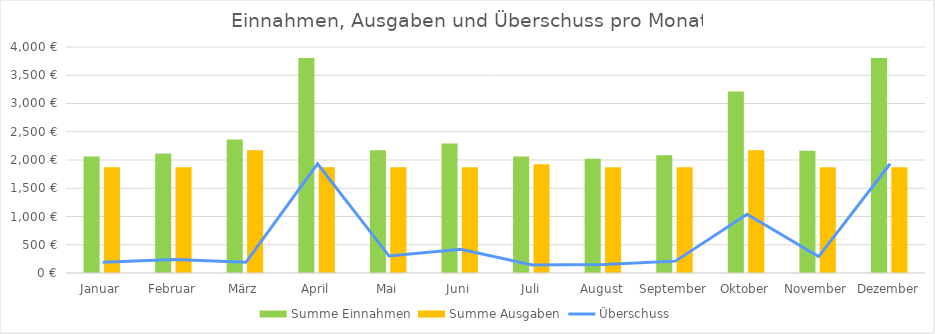
| Category | Summe Einnahmen | Summe Ausgaben |
|---|---|---|
| Januar | 2063 | 1872.987 |
| Februar | 2113 | 1872.987 |
| März | 2363 | 2172.987 |
| April | 3806 | 1872.987 |
| Mai | 2173 | 1872.987 |
| Juni | 2293 | 1872.987 |
| Juli | 2063 | 1922.987 |
| August | 2023 | 1872.987 |
| September | 2083 | 1872.987 |
| Oktober | 3213 | 2172.987 |
| November | 2163 | 1872.987 |
| Dezember | 3806 | 1872.987 |